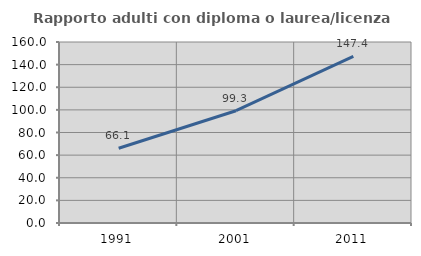
| Category | Rapporto adulti con diploma o laurea/licenza media  |
|---|---|
| 1991.0 | 66.061 |
| 2001.0 | 99.258 |
| 2011.0 | 147.376 |